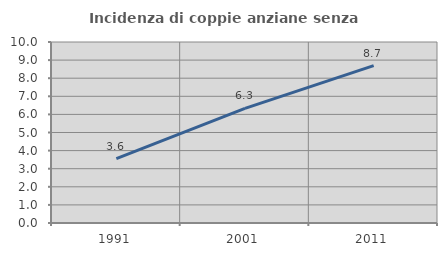
| Category | Incidenza di coppie anziane senza figli  |
|---|---|
| 1991.0 | 3.554 |
| 2001.0 | 6.334 |
| 2011.0 | 8.696 |